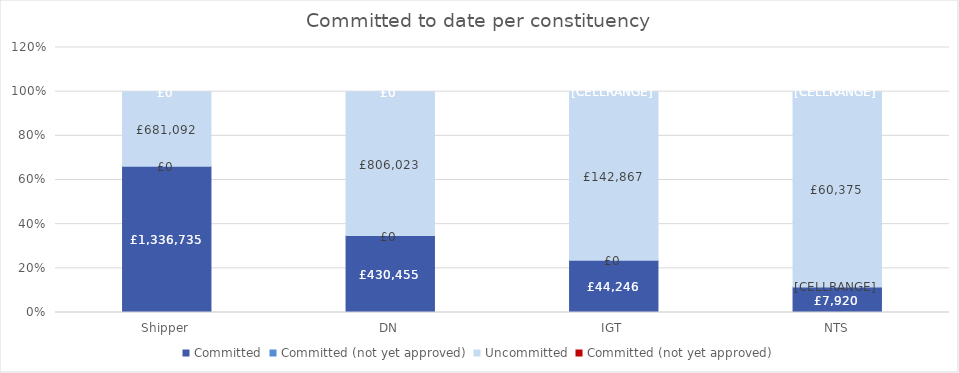
| Category | Committed | Committed (not yet approved) | Uncommitted |
|---|---|---|---|
| Shipper | 0.662 | 0 | 0.338 |
| DN | 0.348 | 0 | 0.652 |
| IGT | 0.236 | 0 | 0.764 |
| NTS | 0.116 | 0 | 0.884 |